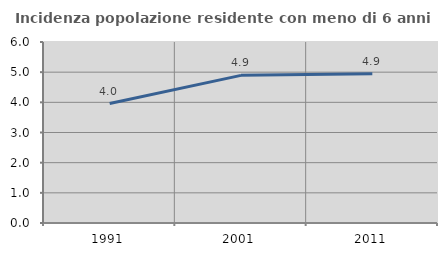
| Category | Incidenza popolazione residente con meno di 6 anni |
|---|---|
| 1991.0 | 3.96 |
| 2001.0 | 4.895 |
| 2011.0 | 4.95 |